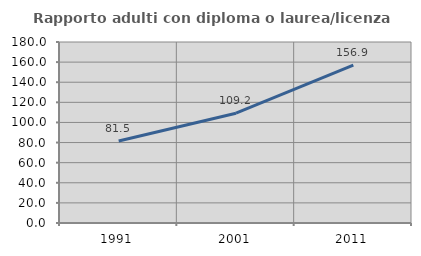
| Category | Rapporto adulti con diploma o laurea/licenza media  |
|---|---|
| 1991.0 | 81.503 |
| 2001.0 | 109.211 |
| 2011.0 | 156.927 |